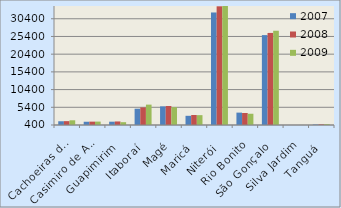
| Category | 2007 | 2008 | 2009 |
|---|---|---|---|
| Cachoeiras de Macacu | 1457 | 1490 | 1730 |
| Casimiro de Abreu | 1317 | 1350 | 1361 |
| Guapimirim | 1332 | 1402 | 1196 |
| Itaboraí | 4997 | 5364 | 6153 |
| Magé | 5664 | 5771 | 5426 |
| Maricá | 2997 | 3216 | 3183 |
| Niterói | 32172 | 33912 | 34915 |
| Rio Bonito | 3896 | 3797 | 3577 |
| São Gonçalo | 25781 | 26394 | 27014 |
| Silva Jardim | 359 | 331 | 412 |
| Tanguá | 540 | 590 | 645 |